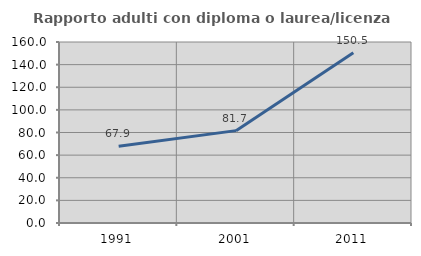
| Category | Rapporto adulti con diploma o laurea/licenza media  |
|---|---|
| 1991.0 | 67.901 |
| 2001.0 | 81.651 |
| 2011.0 | 150.476 |